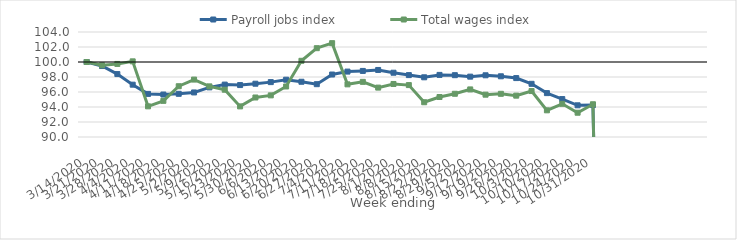
| Category | Payroll jobs index | Total wages index |
|---|---|---|
| 14/03/2020 | 100 | 100 |
| 21/03/2020 | 99.463 | 99.561 |
| 28/03/2020 | 98.391 | 99.743 |
| 04/04/2020 | 96.976 | 100.087 |
| 11/04/2020 | 95.746 | 94.089 |
| 18/04/2020 | 95.662 | 94.819 |
| 25/04/2020 | 95.758 | 96.77 |
| 02/05/2020 | 95.94 | 97.656 |
| 09/05/2020 | 96.62 | 96.752 |
| 16/05/2020 | 96.986 | 96.306 |
| 23/05/2020 | 96.924 | 94.08 |
| 30/05/2020 | 97.104 | 95.267 |
| 06/06/2020 | 97.317 | 95.55 |
| 13/06/2020 | 97.638 | 96.737 |
| 20/06/2020 | 97.365 | 100.16 |
| 27/06/2020 | 97.044 | 101.844 |
| 04/07/2020 | 98.33 | 102.512 |
| 11/07/2020 | 98.722 | 97.021 |
| 18/07/2020 | 98.81 | 97.354 |
| 25/07/2020 | 98.939 | 96.586 |
| 01/08/2020 | 98.57 | 97.069 |
| 08/08/2020 | 98.253 | 96.922 |
| 15/08/2020 | 97.96 | 94.634 |
| 22/08/2020 | 98.279 | 95.332 |
| 29/08/2020 | 98.242 | 95.764 |
| 05/09/2020 | 98.047 | 96.345 |
| 12/09/2020 | 98.228 | 95.643 |
| 19/09/2020 | 98.094 | 95.759 |
| 26/09/2020 | 97.856 | 95.513 |
| 03/10/2020 | 97.091 | 96.129 |
| 10/10/2020 | 95.852 | 93.558 |
| 17/10/2020 | 95.057 | 94.425 |
| 24/10/2020 | 94.226 | 93.236 |
| 31/10/2020 | 94.263 | 94.366 |